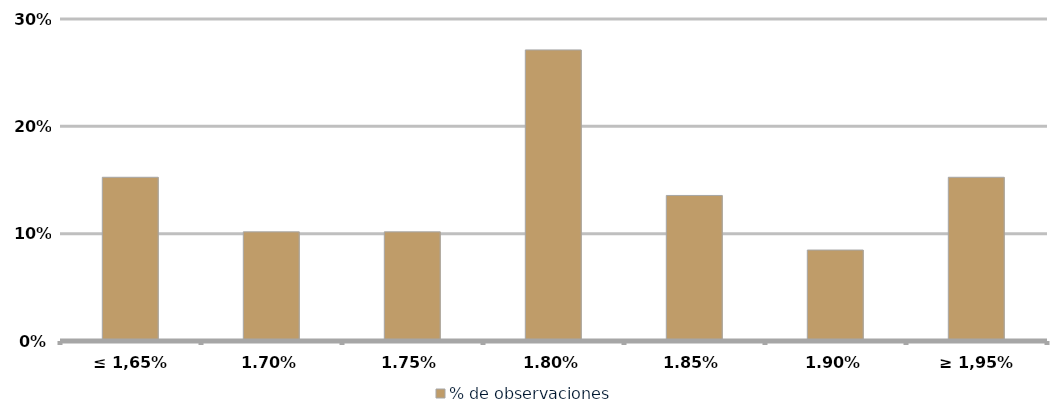
| Category | % de observaciones  |
|---|---|
| ≤ 1,65% | 0.153 |
| 1,70% | 0.102 |
| 1,75% | 0.102 |
| 1,80% | 0.271 |
| 1,85% | 0.136 |
| 1,90% | 0.085 |
| ≥ 1,95% | 0.153 |